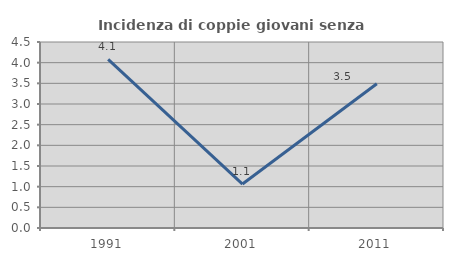
| Category | Incidenza di coppie giovani senza figli |
|---|---|
| 1991.0 | 4.082 |
| 2001.0 | 1.064 |
| 2011.0 | 3.488 |